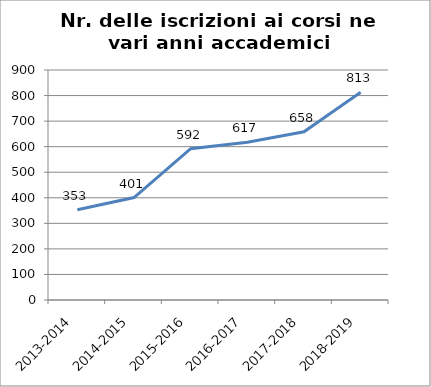
| Category | Nr. Iscrizioni ai Corsi |
|---|---|
| 2013-2014 | 353 |
| 2014-2015 | 401 |
| 2015-2016 | 592 |
| 2016-2017 | 617 |
| 2017-2018 | 658 |
| 2018-2019 | 813 |